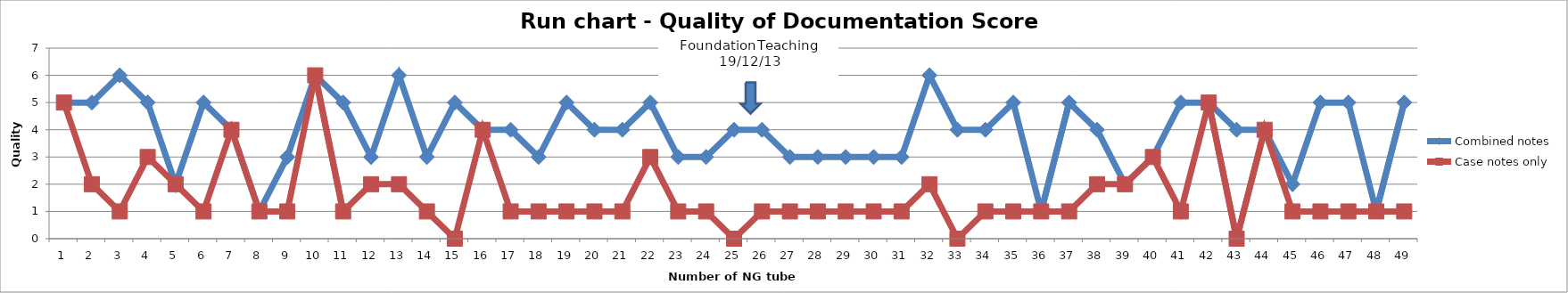
| Category | Combined notes | Case notes only |
|---|---|---|
| 0 | 5 | 5 |
| 1 | 5 | 2 |
| 2 | 6 | 1 |
| 3 | 5 | 3 |
| 4 | 2 | 2 |
| 5 | 5 | 1 |
| 6 | 4 | 4 |
| 7 | 1 | 1 |
| 8 | 3 | 1 |
| 9 | 6 | 6 |
| 10 | 5 | 1 |
| 11 | 3 | 2 |
| 12 | 6 | 2 |
| 13 | 3 | 1 |
| 14 | 5 | 0 |
| 15 | 4 | 4 |
| 16 | 4 | 1 |
| 17 | 3 | 1 |
| 18 | 5 | 1 |
| 19 | 4 | 1 |
| 20 | 4 | 1 |
| 21 | 5 | 3 |
| 22 | 3 | 1 |
| 23 | 3 | 1 |
| 24 | 4 | 0 |
| 25 | 4 | 1 |
| 26 | 3 | 1 |
| 27 | 3 | 1 |
| 28 | 3 | 1 |
| 29 | 3 | 1 |
| 30 | 3 | 1 |
| 31 | 6 | 2 |
| 32 | 4 | 0 |
| 33 | 4 | 1 |
| 34 | 5 | 1 |
| 35 | 1 | 1 |
| 36 | 5 | 1 |
| 37 | 4 | 2 |
| 38 | 2 | 2 |
| 39 | 3 | 3 |
| 40 | 5 | 1 |
| 41 | 5 | 5 |
| 42 | 4 | 0 |
| 43 | 4 | 4 |
| 44 | 2 | 1 |
| 45 | 5 | 1 |
| 46 | 5 | 1 |
| 47 | 1 | 1 |
| 48 | 5 | 1 |